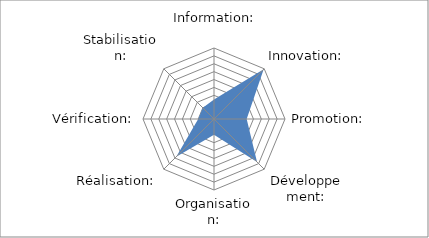
| Category | Series 0 |
|---|---|
| Information: | 0.024 |
| Innovation: | 0.345 |
| Promotion: | 0.107 |
| Développement: | 0.286 |
| Organisation: | 0 |
| Réalisation: | 0.238 |
| Vérification: | 0 |
| Stabilisation: | 0 |